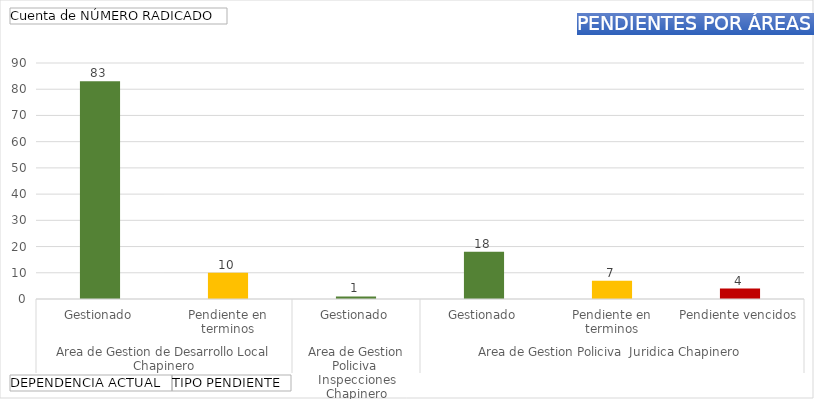
| Category | Total |
|---|---|
| 0 | 83 |
| 1 | 10 |
| 2 | 1 |
| 3 | 18 |
| 4 | 7 |
| 5 | 4 |